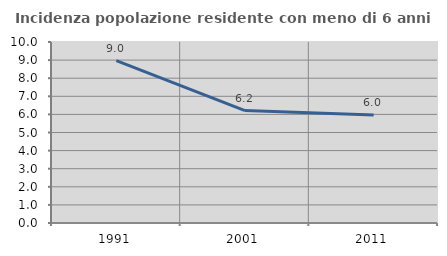
| Category | Incidenza popolazione residente con meno di 6 anni |
|---|---|
| 1991.0 | 8.969 |
| 2001.0 | 6.211 |
| 2011.0 | 5.973 |